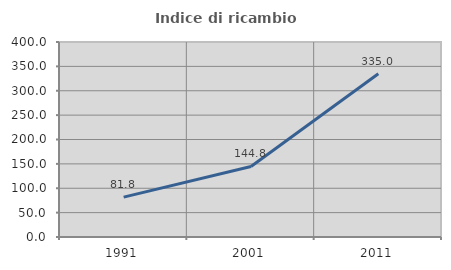
| Category | Indice di ricambio occupazionale  |
|---|---|
| 1991.0 | 81.752 |
| 2001.0 | 144.762 |
| 2011.0 | 335 |